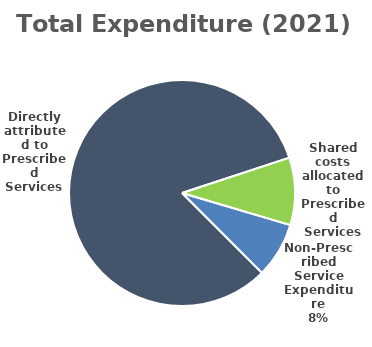
| Category | Series 0 |
|---|---|
| Directly attributed to Prescribed Services | 192.302 |
| Shared costs allocated to Prescribed Services | 22.501 |
| Non-Prescribed Service Expenditure | 18.467 |